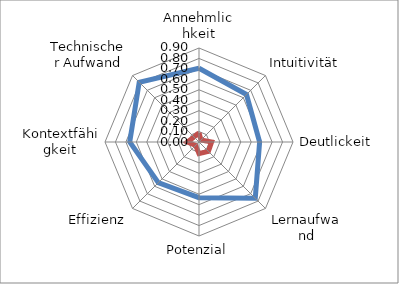
| Category | Series 0 | Series 1 |
|---|---|---|
| Annehmlichkeit | 0.706 | 0.088 |
| Intuitivität | 0.643 | 0.027 |
| Deutlickeit | 0.58 | 0.121 |
| Lernaufwand | 0.762 | 0.127 |
| Potenzial | 0.533 | 0.111 |
| Effizienz | 0.551 | 0.046 |
| Kontextfähigkeit | 0.663 | 0.111 |
| Technischer Aufwand | 0.81 | 0.067 |